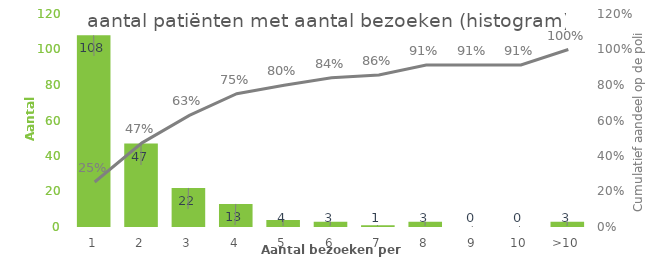
| Category | aantal patiënten |
|---|---|
| 1 | 108 |
| 2 | 47 |
| 3 | 22 |
| 4 | 13 |
| 5 | 4 |
| 6 | 3 |
| 7 | 1 |
| 8 | 3 |
| 9 | 0 |
| 10 | 0 |
| >10 | 3 |